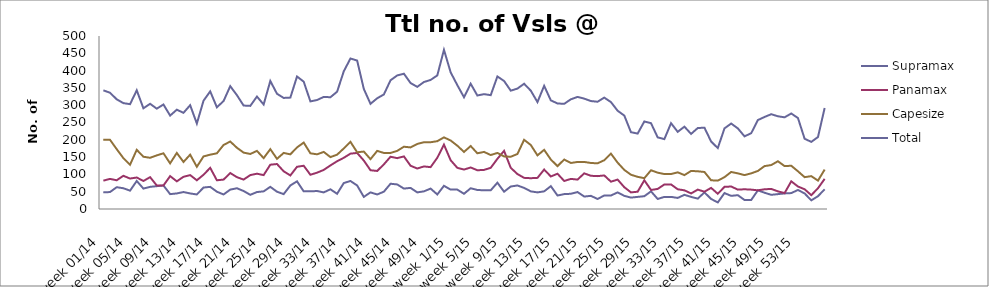
| Category | Supramax | Panamax | Capesize | Total |
|---|---|---|---|---|
| week 01/14 | 48 | 82 | 200 | 343 |
| week 02/14 | 49 | 87 | 200 | 336 |
| week 03/14 | 63 | 83 | 173 | 317 |
| week 04/14 | 60 | 96 | 147 | 306 |
| week 05/14 | 53 | 88 | 128 | 303 |
| week 06/14 | 81 | 91 | 171 | 343 |
| week 07/14 | 59 | 81 | 151 | 291 |
| week 08/14 | 64 | 92 | 148 | 304 |
| week 09/14 | 66 | 68 | 155 | 290 |
| week 10/14 | 68 | 68 | 161 | 302 |
| week 11/14 | 43 | 95 | 132 | 270 |
| week 12/14 | 45 | 80 | 162 | 287 |
| week 13/14 | 49 | 93 | 136 | 278 |
| week 14/14 | 45 | 98 | 157 | 300 |
| week 15/14 | 42 | 83 | 122 | 247 |
| week 16/14 | 62 | 99 | 152 | 313 |
| week 17/14 | 64 | 119 | 157 | 340 |
| week 18/14 | 50 | 83 | 161 | 294 |
| week 19/14 | 42 | 85 | 185 | 312 |
| week 20/14 | 56 | 104 | 195 | 355 |
| week 21/14 | 60 | 92 | 177 | 329 |
| week 22/14 | 52 | 85 | 163 | 299 |
| week 23/14 | 41 | 98 | 159 | 298 |
| week 24/14 | 49 | 102 | 168 | 325 |
| week 25/14 | 51 | 98 | 147 | 302 |
| week 26/14 | 64 | 128 | 173 | 370 |
| week 27/14 | 50 | 130 | 145 | 333 |
| week 28/14 | 43 | 109 | 162 | 321 |
| week 29/14 | 68 | 97 | 158 | 322 |
| week 30/14 | 80 | 122 | 178 | 383 |
| week 31/14 | 51 | 125 | 192 | 368 |
| week 32/14 | 51 | 99 | 161 | 311 |
| week 33/14 | 52 | 105 | 158 | 315 |
| week 34/14 | 48 | 113 | 165 | 324 |
| week 35/14 | 57 | 126 | 150 | 323 |
| week 36/14 | 44 | 138 | 157 | 339 |
| week 37/14 | 75 | 148 | 175 | 398 |
| week 38/14 | 81 | 160 | 194 | 435 |
| week 39/14 | 68 | 162 | 164 | 429 |
| week 40/14 | 35 | 140 | 166 | 347 |
| week 41/14 | 48 | 112 | 144 | 304 |
| week 42/14 | 42 | 110 | 168 | 320 |
| week 43/14 | 50 | 129 | 162 | 331 |
| week 44/14 | 73 | 151 | 162 | 372 |
| week 45/14 | 71 | 147 | 168 | 386 |
| week 46/14 | 59 | 152 | 180 | 391 |
| week 47/14 | 61 | 125 | 178 | 364 |
| week 48/14 | 48 | 117 | 188 | 353 |
| week 49/14 | 51 | 123 | 193 | 367 |
| week 50/14 | 59 | 121 | 193 | 373 |
| week 51/14 | 42 | 148 | 196 | 386 |
| week 52/14 | 67 | 186 | 207 | 460 |
| week 1/15 | 56 | 141 | 198 | 395 |
| week 2/15 | 56 | 119 | 183 | 358 |
| week 3/15 | 44 | 114 | 165 | 323 |
| week 4/15 | 60 | 120 | 182 | 362 |
| week 5/15 | 55 | 112 | 161 | 328 |
| week 6/15 | 54 | 113 | 165 | 332 |
| week 7/15 | 54 | 119 | 156 | 329 |
| week 8/15 | 76 | 145 | 162 | 383 |
| week 9/15 | 50 | 168 | 152 | 370 |
| week 10/15 | 65 | 119 | 151 | 342 |
| week 11/15 | 68 | 101 | 159 | 348 |
| week 12/15 | 61 | 90 | 200 | 362 |
| week 13/15 | 51 | 89 | 185 | 342 |
| week 14/15 | 48 | 90 | 155 | 309 |
| week 15/15 | 51 | 114 | 171 | 356 |
| week 16/15 | 66 | 94 | 143 | 314 |
| week 17/15 | 39 | 102 | 124 | 305 |
| week 18/15 | 43 | 81 | 143 | 304 |
| week 19/15 | 44 | 87 | 133 | 317 |
| week 20/15 | 49 | 85 | 136 | 324 |
| week 21/15 | 36 | 103 | 136 | 319 |
| week 22/15 | 38 | 96 | 133 | 312 |
| week 23/15 | 29 | 95 | 132 | 310 |
| week 24/15 | 39 | 97 | 141 | 322 |
| week 25/15 | 39 | 79 | 160 | 309 |
| week 26/15 | 48 | 85 | 134 | 284 |
| week 27/15 | 38 | 63 | 113 | 270 |
| week 28/15 | 33 | 48 | 99 | 222 |
| week 29/15 | 35 | 50 | 93 | 218 |
| week 30/15 | 37 | 83 | 89 | 253 |
| week 31/15 | 51 | 55 | 112 | 248 |
| week 32/15 | 29 | 58 | 105 | 207 |
| week 33/15 | 35 | 71 | 101 | 202 |
| week 34/15 | 35 | 71 | 101 | 248 |
| week 35/15 | 32 | 57 | 106 | 223 |
| week 36/15 | 41 | 54 | 98 | 238 |
| week 37/15 | 35 | 45 | 110 | 217 |
| week 38/15 | 30 | 56 | 109 | 234 |
| week 39/15 | 48 | 50 | 107 | 235 |
| week 40/15 | 29 | 61 | 83 | 195 |
| week 41/15 | 19 | 44 | 82 | 176 |
| week 42/15 | 46 | 64 | 92 | 233 |
| week 43/15 | 38 | 65 | 107 | 247 |
| week 44/15 | 40 | 56 | 103 | 233 |
| week 45/15 | 26 | 57 | 98 | 210 |
| week 46/15 | 26 | 56 | 103 | 219 |
| week 47/15 | 54 | 54 | 110 | 257 |
| week 48/15 | 47 | 57 | 124 | 266 |
| week 49/15 | 41 | 58 | 127 | 274 |
| week 50/15 | 43 | 51 | 138 | 268 |
| week 51/15 | 45 | 46 | 124 | 265 |
| week 52/15 | 46 | 80 | 125 | 276 |
| week 53/15 | 55 | 65 | 109 | 263 |
| week 01/16 | 45 | 57 | 92 | 203 |